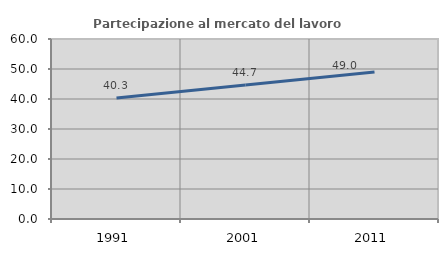
| Category | Partecipazione al mercato del lavoro  femminile |
|---|---|
| 1991.0 | 40.299 |
| 2001.0 | 44.665 |
| 2011.0 | 49 |